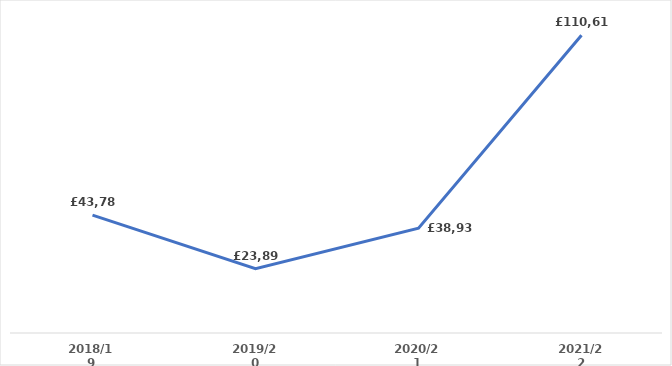
| Category | Series 0 |
|---|---|
| 2018/19 | 43784.94 |
| 2019/20 | 23892.26 |
| 2020/21 | 38929.8 |
| 2021/22 | 110614 |